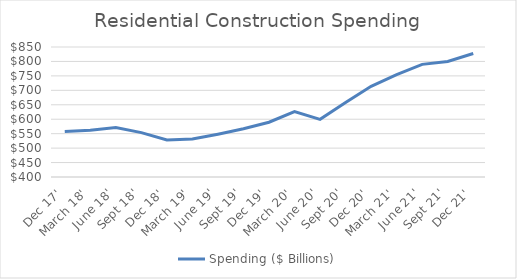
| Category | Spending ($ Billions) |
|---|---|
| Dec 17' | 557.65 |
| March 18' | 562.17 |
| June 18' | 570.89 |
| Sept 18' | 553.58 |
| Dec 18' | 528.12 |
| March 19' | 531.41 |
| June 19' | 548.31 |
| Sept 19' | 567.18 |
| Dec 19' | 589.63 |
| March 20' | 626.58 |
| June 20' | 599.66 |
| Sept 20' | 657.61 |
| Dec 20' | 714 |
| March 21' | 754.14 |
| June 21' | 789.83 |
| Sept 21' | 800.12 |
| Dec 21' | 827.61 |